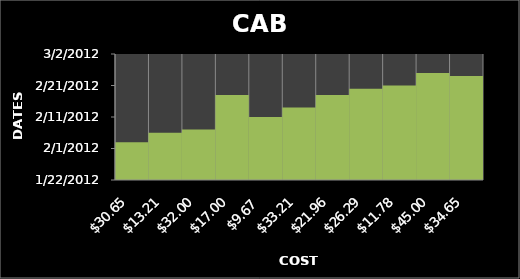
| Category | Series 0 |
|---|---|
| 30.65 | 2/3/12 |
| 13.21 | 2/6/12 |
| 32.0 | 2/7/12 |
| 17.0 | 2/18/12 |
| 9.67 | 2/11/12 |
| 33.21 | 2/14/12 |
| 21.96 | 2/18/12 |
| 26.29 | 2/20/12 |
| 11.78 | 2/21/12 |
| 45.0 | 2/25/12 |
| 34.65 | 2/24/12 |